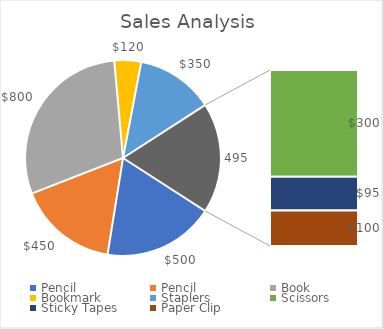
| Category | Series 0 |
|---|---|
| Pencil | 500 |
| Pencil | 450 |
| Book | 800 |
| Bookmark | 120 |
| Staplers | 350 |
| Scissors | 300 |
| Sticky Tapes | 95 |
| Paper Clip | 100 |